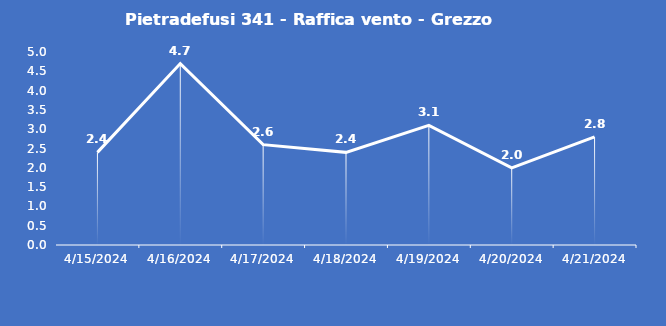
| Category | Pietradefusi 341 - Raffica vento - Grezzo (m/s) |
|---|---|
| 4/15/24 | 2.4 |
| 4/16/24 | 4.7 |
| 4/17/24 | 2.6 |
| 4/18/24 | 2.4 |
| 4/19/24 | 3.1 |
| 4/20/24 | 2 |
| 4/21/24 | 2.8 |